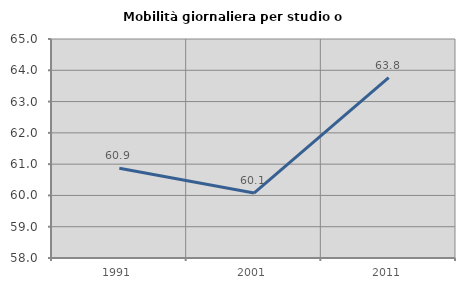
| Category | Mobilità giornaliera per studio o lavoro |
|---|---|
| 1991.0 | 60.87 |
| 2001.0 | 60.075 |
| 2011.0 | 63.767 |